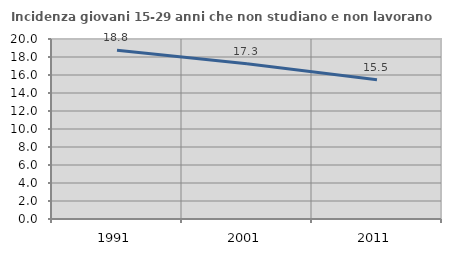
| Category | Incidenza giovani 15-29 anni che non studiano e non lavorano  |
|---|---|
| 1991.0 | 18.75 |
| 2001.0 | 17.262 |
| 2011.0 | 15.484 |